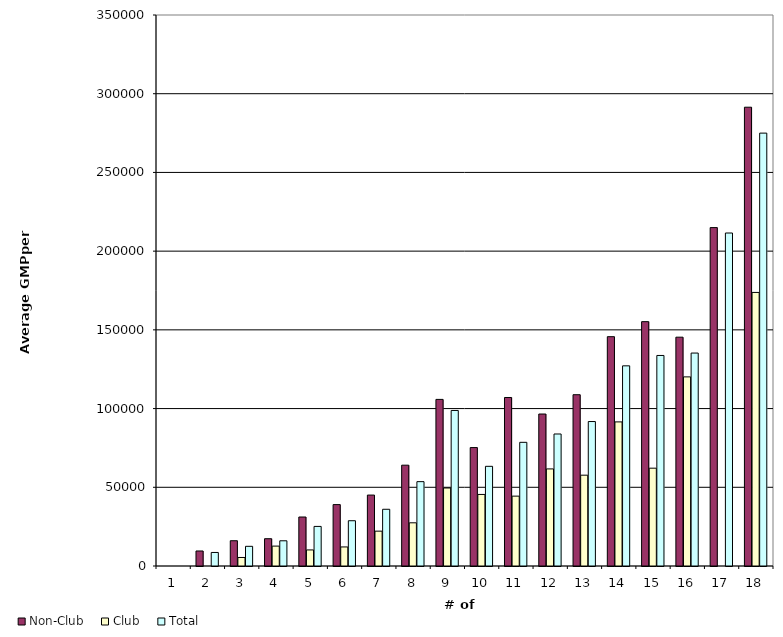
| Category | Non-Club | Club | Total |
|---|---|---|---|
| 1.0 | 0 | 0 | 0 |
| 2.0 | 9542.189 | 0 | 8599.514 |
| 3.0 | 16049.977 | 5410.468 | 12503.474 |
| 4.0 | 17329.462 | 12637.243 | 16009.775 |
| 5.0 | 31115.913 | 10209.409 | 25142.626 |
| 6.0 | 39001.02 | 12103.472 | 28754.335 |
| 7.0 | 45058.23 | 22142.256 | 36030.725 |
| 8.0 | 64043.597 | 27433.901 | 53583.684 |
| 9.0 | 105830.891 | 49548.982 | 98795.653 |
| 10.0 | 75223.132 | 45454.903 | 63315.84 |
| 11.0 | 107042.003 | 44376.2 | 78557.547 |
| 12.0 | 96533.831 | 61672.002 | 83856.802 |
| 13.0 | 108806.49 | 57690.25 | 91767.743 |
| 14.0 | 145667.44 | 91536.19 | 127148.854 |
| 15.0 | 155210.72 | 62138.905 | 133732.608 |
| 16.0 | 145350.127 | 120128.673 | 135261.545 |
| 17.0 | 214955.35 | 0 | 211523.366 |
| 18.0 | 291426.398 | 173777.611 | 274972.023 |